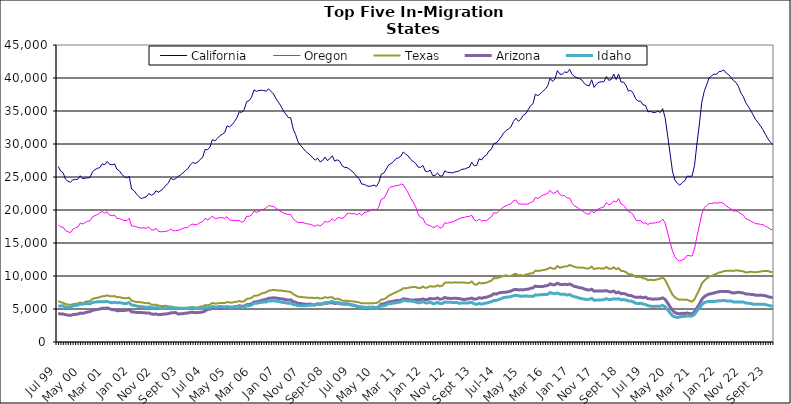
| Category |  California  |  Oregon  |  Texas  |  Arizona  |  Idaho  |
|---|---|---|---|---|---|
| Jul 99 | 26605 | 17749 | 6209 | 4339 | 5471 |
| Aug 99 | 25882 | 17447 | 6022 | 4228 | 5444 |
| Sep 99 | 25644 | 17401 | 5941 | 4237 | 5488 |
| Oct 99 | 24669 | 16875 | 5751 | 4134 | 5279 |
| Nov 99 | 24353 | 16701 | 5680 | 4073 | 5260 |
| Dec 99 | 24218 | 16570 | 5619 | 4042 | 5269 |
| Jan 00 | 24574 | 17109 | 5736 | 4142 | 5485 |
| Feb 00 | 24620 | 17295 | 5789 | 4192 | 5530 |
| Mar 00 | 24655 | 17436 | 5826 | 4226 | 5590 |
| Apr 00 | 25195 | 18009 | 5980 | 4375 | 5748 |
| May 00 | 24730 | 17875 | 5897 | 4337 | 5729 |
| Jun 00 | 24825 | 18113 | 6070 | 4444 | 5853 |
| Jul 00 | 24857 | 18294 | 6163 | 4555 | 5824 |
| Aug 00 | 24913 | 18376 | 6199 | 4603 | 5788 |
| Sep 00 | 25792 | 18971 | 6529 | 4804 | 5976 |
| Oct 00 | 26106 | 19135 | 6643 | 4870 | 6058 |
| Nov 00 | 26315 | 19306 | 6705 | 4926 | 6085 |
| Dec 00 | 26415 | 19570 | 6793 | 4991 | 6096 |
| Jan 01 | 26995 | 19781 | 6942 | 5122 | 6119 |
| Feb 01 | 26851 | 19519 | 6948 | 5089 | 6090 |
| Mar 01 | 27352 | 19720 | 7080 | 5180 | 6143 |
| Apr 01 | 26918 | 19221 | 6943 | 5020 | 6020 |
| May 01 | 26848 | 19126 | 6924 | 4899 | 5950 |
| Jun 01 | 26974 | 19241 | 6959 | 4895 | 6019 |
| Jul 01 | 26172 | 18725 | 6778 | 4737 | 5951 |
| Aug 01 | 25943 | 18736 | 6810 | 4757 | 5973 |
| Sep 01 | 25399 | 18514 | 6688 | 4753 | 5895 |
| Oct 01 | 25050 | 18415 | 6650 | 4780 | 5833 |
| Nov 01 | 24873 | 18381 | 6631 | 4826 | 5850 |
| Dec 01 | 25099 | 18765 | 6708 | 4898 | 5969 |
| Jan 02 | 23158 | 17561 | 6261 | 4560 | 5595 |
| Feb 02 | 22926 | 17573 | 6162 | 4531 | 5560 |
| Mar 02 | 22433 | 17452 | 6052 | 4481 | 5458 |
| Apr 02 | 22012 | 17314 | 6046 | 4458 | 5380 |
| May 02 | 21733 | 17267 | 6007 | 4452 | 5358 |
| Jun 02 | 21876 | 17298 | 5933 | 4444 | 5315 |
| Jul 02 | 21997 | 17209 | 5873 | 4383 | 5243 |
| Aug 02 | 22507 | 17436 | 5929 | 4407 | 5315 |
| Sep 02 | 22244 | 17010 | 5672 | 4248 | 5192 |
| Oct 02 | 22406 | 16952 | 5625 | 4191 | 5167 |
| Nov 02 | 22922 | 17223 | 5663 | 4242 | 5221 |
| Dec 02 | 22693 | 16770 | 5499 | 4142 | 5120 |
| Jan 03 | 22964 | 16694 | 5463 | 4166 | 5089 |
| Feb 03 | 23276 | 16727 | 5461 | 4226 | 5077 |
| Mar 03 | 23736 | 16766 | 5486 | 4251 | 5145 |
| Apr 03 | 24079 | 16859 | 5389 | 4289 | 5145 |
| May 03 | 24821 | 17117 | 5378 | 4415 | 5254 |
| Jun 03 | 24592 | 16812 | 5273 | 4426 | 5135 |
| Jul 03 | 24754 | 16875 | 5226 | 4466 | 5124 |
| Aug 03 | 25092 | 16922 | 5181 | 4244 | 5100 |
| Sep 03 | 25316 | 17036 | 5181 | 4279 | 5086 |
| Oct 03 | 25622 | 17228 | 5139 | 4301 | 5110 |
| Nov 03 | 25984 | 17335 | 5175 | 4362 | 5091 |
| Dec 03 | 26269 | 17350 | 5189 | 4396 | 5113 |
| Jan 04 | 26852 | 17734 | 5255 | 4492 | 5152 |
| Feb 04 | 27184 | 17860 | 5301 | 4502 | 5183 |
| Mar 04 | 27062 | 17757 | 5227 | 4443 | 5056 |
| Apr 04 | 27238 | 17840 | 5227 | 4461 | 5104 |
| May 04 | 27671 | 18113 | 5345 | 4493 | 5095 |
| Jun 04 | 27949 | 18201 | 5416 | 4532 | 5103 |
| Jul 04 | 29172 | 18727 | 5597 | 4697 | 5231 |
| Aug 04 | 29122 | 18529 | 5561 | 4945 | 5197 |
| Sep 04 | 29542 | 18678 | 5656 | 4976 | 5237 |
| Oct 04 | 30674 | 19108 | 5922 | 5188 | 5363 |
| Nov 04 | 30472 | 18716 | 5823 | 5106 | 5321 |
| Dec 04 | 30831 | 18755 | 5838 | 5135 | 5312 |
| Jan 05 | 31224 | 18823 | 5906 | 5155 | 5374 |
| Feb 05 | 31495 | 18842 | 5898 | 5168 | 5357 |
| Mar 05 | 31714 | 18738 | 5894 | 5212 | 5313 |
| Apr 05 | 32750 | 18998 | 6060 | 5340 | 5350 |
| May 05 | 32575 | 18504 | 5989 | 5269 | 5276 |
| Jun 05 | 32898 | 18414 | 5954 | 5252 | 5271 |
| Jul 05 | 33384 | 18395 | 6062 | 5322 | 5322 |
| Aug 05 | 33964 | 18381 | 6113 | 5375 | 5316 |
| Sep 05 | 34897 | 18426 | 6206 | 5493 | 5362 |
| Oct 05 | 34780 | 18132 | 6100 | 5408 | 5308 |
| Nov 05 | 35223 | 18332 | 6162 | 5434 | 5314 |
| Dec 05 | 36415 | 19047 | 6508 | 5658 | 5487 |
| Jan 06 | 36567 | 19032 | 6576 | 5688 | 5480 |
| Feb 06 | 37074 | 19257 | 6692 | 5792 | 5616 |
| Mar 06 | 38207 | 19845 | 6993 | 6052 | 5850 |
| Apr 06 | 37976 | 19637 | 7024 | 6101 | 5864 |
| May 06 | 38099 | 19781 | 7114 | 6178 | 5943 |
| Jun 06 | 38141 | 20061 | 7331 | 6276 | 6018 |
| Jul 06 | 38097 | 20111 | 7431 | 6399 | 6046 |
| Aug 06 | 38021 | 20333 | 7542 | 6450 | 6064 |
| Sep 06 | 38349 | 20686 | 7798 | 6627 | 6232 |
| Oct 06 | 37947 | 20591 | 7825 | 6647 | 6216 |
| Nov 06 | 37565 | 20526 | 7907 | 6707 | 6244 |
| Dec 06 | 36884 | 20272 | 7840 | 6648 | 6192 |
| Jan 07 | 36321 | 19984 | 7789 | 6597 | 6151 |
| Feb 07 | 35752 | 19752 | 7799 | 6554 | 6048 |
| Mar 07 | 35025 | 19547 | 7737 | 6487 | 5989 |
| Apr 07 | 34534 | 19412 | 7685 | 6430 | 5937 |
| May 07 | 34022 | 19296 | 7654 | 6353 | 5858 |
| Jun 07 | 33974 | 19318 | 7577 | 6390 | 5886 |
| Jul 07 | 32298 | 18677 | 7250 | 6117 | 5682 |
| Aug 07 | 31436 | 18322 | 7070 | 6034 | 5617 |
| Sep 07 | 30331 | 18087 | 6853 | 5847 | 5500 |
| Oct 07 | 29813 | 18108 | 6839 | 5821 | 5489 |
| Nov 07 | 29384 | 18105 | 6777 | 5769 | 5481 |
| Dec 07 | 28923 | 17949 | 6760 | 5733 | 5499 |
| Jan 08 | 28627 | 17890 | 6721 | 5732 | 5521 |
| Feb 08 | 28328 | 17834 | 6719 | 5749 | 5579 |
| Mar 08 | 27911 | 17680 | 6690 | 5650 | 5614 |
| Apr 08 | 27543 | 17512 | 6656 | 5612 | 5635 |
| May 08 | 27856 | 17754 | 6705 | 5774 | 5798 |
| Jun 08 | 27287 | 17589 | 6593 | 5717 | 5745 |
| Jul 08 | 27495 | 17834 | 6623 | 5761 | 5807 |
| Aug 08 | 28018 | 18309 | 6789 | 5867 | 5982 |
| Sep-08 | 27491 | 18164 | 6708 | 5864 | 5954 |
| Oct 08 | 27771 | 18291 | 6755 | 5942 | 6032 |
| Nov 08 | 28206 | 18706 | 6787 | 5970 | 6150 |
| Dec 08 | 27408 | 18353 | 6505 | 5832 | 5975 |
| Jan 09 | 27601 | 18778 | 6569 | 5890 | 5995 |
| Feb 09 | 27394 | 18863 | 6483 | 5845 | 5936 |
| Mar 09 | 26690 | 18694 | 6273 | 5751 | 5806 |
| Apr 09 | 26461 | 18943 | 6222 | 5735 | 5777 |
| May 09 | 26435 | 19470 | 6272 | 5819 | 5767 |
| Jun 09 | 26187 | 19522 | 6199 | 5700 | 5649 |
| Jul 09 | 25906 | 19408 | 6171 | 5603 | 5617 |
| Aug 09 | 25525 | 19469 | 6128 | 5533 | 5540 |
| Sep 09 | 25050 | 19249 | 6059 | 5405 | 5437 |
| Oct 09 | 24741 | 19529 | 6004 | 5349 | 5369 |
| Nov 09 | 23928 | 19187 | 5854 | 5271 | 5248 |
| Dec 09 | 23899 | 19607 | 5886 | 5261 | 5195 |
| Jan 10 | 23676 | 19703 | 5881 | 5232 | 5234 |
| Feb 10 | 23592 | 19845 | 5850 | 5272 | 5236 |
| Mar 10 | 23634 | 19946 | 5864 | 5278 | 5219 |
| Apr 10 | 23774 | 20134 | 5889 | 5257 | 5201 |
| May 10 | 23567 | 19966 | 5897 | 5172 | 5105 |
| Jun 10 | 24166 | 20464 | 6087 | 5356 | 5237 |
| Jul 10 | 25410 | 21627 | 6417 | 5742 | 5452 |
| Aug 10 | 25586 | 21744 | 6465 | 5797 | 5491 |
| Sep 10 | 26150 | 22314 | 6667 | 5907 | 5609 |
| Oct 10 | 26807 | 23219 | 6986 | 6070 | 5831 |
| Nov 10 | 27033 | 23520 | 7179 | 6100 | 5810 |
| Dec 10 | 27332 | 23551 | 7361 | 6182 | 5898 |
| Jan 11 | 27769 | 23697 | 7525 | 6276 | 5938 |
| Feb 11 | 27898 | 23718 | 7708 | 6267 | 6016 |
| Mar 11 | 28155 | 23921 | 7890 | 6330 | 6081 |
| Apr 11 | 28790 | 23847 | 8146 | 6544 | 6305 |
| May 11 | 28471 | 23215 | 8131 | 6502 | 6248 |
| Jun 11 | 28191 | 22580 | 8199 | 6445 | 6217 |
| Jul 11 | 27678 | 21867 | 8291 | 6368 | 6202 |
| Aug 11 | 27372 | 21203 | 8321 | 6356 | 6146 |
| Sep 11 | 27082 | 20570 | 8341 | 6387 | 6075 |
| Oct 11 | 26528 | 19442 | 8191 | 6402 | 5932 |
| Nov 11 | 26440 | 18872 | 8176 | 6426 | 5968 |
| Dec 11 | 26770 | 18784 | 8401 | 6533 | 6106 |
| Jan 12 | 25901 | 17963 | 8202 | 6390 | 5933 |
| Feb 12 | 25796 | 17718 | 8266 | 6456 | 5900 |
| Mar 12 | 26042 | 17647 | 8456 | 6600 | 6054 |
| Apr 12 | 25239 | 17386 | 8388 | 6534 | 5838 |
| May 12 | 25238 | 17407 | 8401 | 6558 | 5854 |
| Jun 12 | 25593 | 17673 | 8594 | 6669 | 6009 |
| Jul 12 | 25155 | 17237 | 8432 | 6474 | 5817 |
| Aug 12 | 25146 | 17391 | 8536 | 6539 | 5842 |
| Sep 12 | 25942 | 18102 | 8989 | 6759 | 6061 |
| Oct 12 | 25718 | 17953 | 9012 | 6618 | 6027 |
| Nov 12 | 25677 | 18134 | 9032 | 6611 | 6009 |
| Dec 12 | 25619 | 18166 | 8981 | 6601 | 5999 |
| Jan 13 | 25757 | 18344 | 9051 | 6627 | 5989 |
| Feb-13 | 25830 | 18512 | 9001 | 6606 | 5968 |
| Mar-13 | 25940 | 18689 | 9021 | 6577 | 5853 |
| Apr 13 | 26187 | 18844 | 9013 | 6478 | 5925 |
| May 13 | 26192 | 18884 | 9003 | 6431 | 5924 |
| Jun-13 | 26362 | 19013 | 8948 | 6508 | 5896 |
| Jul 13 | 26467 | 19037 | 8958 | 6559 | 5948 |
| Aug 13 | 27253 | 19198 | 9174 | 6655 | 6020 |
| Sep 13 | 26711 | 18501 | 8747 | 6489 | 5775 |
| Oct 13 | 26733 | 18301 | 8681 | 6511 | 5711 |
| Nov 13 | 27767 | 18620 | 8989 | 6709 | 5860 |
| Dec 13 | 27583 | 18320 | 8863 | 6637 | 5740 |
| Jan 14 | 28107 | 18409 | 8939 | 6735 | 5843 |
| Feb-14 | 28313 | 18383 | 8989 | 6779 | 5893 |
| Mar 14 | 28934 | 18696 | 9160 | 6918 | 6015 |
| Apr 14 | 29192 | 18946 | 9291 | 7036 | 6099 |
| May 14 | 30069 | 19603 | 9701 | 7314 | 6304 |
| Jun 14 | 30163 | 19487 | 9641 | 7252 | 6293 |
| Jul-14 | 30587 | 19754 | 9752 | 7415 | 6427 |
| Aug-14 | 31074 | 20201 | 9882 | 7499 | 6557 |
| Sep 14 | 31656 | 20459 | 9997 | 7536 | 6719 |
| Oct 14 | 32037 | 20663 | 10109 | 7555 | 6786 |
| Nov 14 | 32278 | 20825 | 9992 | 7628 | 6831 |
| Dec 14 | 32578 | 20918 | 10006 | 7705 | 6860 |
| Jan 15 | 33414 | 21396 | 10213 | 7906 | 7000 |
| Feb 15 | 33922 | 21518 | 10337 | 7982 | 7083 |
| Mar 15 | 33447 | 20942 | 10122 | 7891 | 7006 |
| Apr-15 | 33731 | 20893 | 10138 | 7906 | 6931 |
| May 15 | 34343 | 20902 | 10053 | 7895 | 6952 |
| Jun-15 | 34572 | 20870 | 10192 | 7973 | 6966 |
| Jul 15 | 35185 | 20916 | 10303 | 8000 | 6949 |
| Aug 15 | 35780 | 21115 | 10399 | 8126 | 6938 |
| Sep 15 | 36109 | 21246 | 10428 | 8207 | 6896 |
| Oct 15 | 37555 | 21908 | 10813 | 8477 | 7140 |
| Nov 15 | 37319 | 21750 | 10763 | 8390 | 7112 |
| Dec 15 | 37624 | 21990 | 10807 | 8395 | 7149 |
| Jan 16 | 37978 | 22248 | 10892 | 8388 | 7201 |
| Feb 16 | 38285 | 22369 | 10951 | 8508 | 7192 |
| Mar 16 | 38792 | 22506 | 11075 | 8547 | 7226 |
| Apr 16 | 39994 | 22999 | 11286 | 8815 | 7487 |
| May 16 | 39488 | 22548 | 11132 | 8673 | 7382 |
| Jun 16 | 39864 | 22556 | 11100 | 8682 | 7315 |
| Jul 16 | 41123 | 22989 | 11516 | 8903 | 7420 |
| Aug 16 | 40573 | 22333 | 11251 | 8731 | 7261 |
| Sep 16 | 40560 | 22162 | 11340 | 8692 | 7216 |
| Oct 16 | 40923 | 22172 | 11456 | 8742 | 7233 |
| Nov 16 | 40817 | 21818 | 11459 | 8685 | 7101 |
| Dec 16 | 41311 | 21815 | 11681 | 8783 | 7203 |
| Jan 17 | 40543 | 21029 | 11524 | 8609 | 6982 |
| Feb 17 | 40218 | 20613 | 11385 | 8416 | 6852 |
| Mar 17 | 40052 | 20425 | 11276 | 8354 | 6775 |
| Apr 17 | 39913 | 20147 | 11297 | 8218 | 6653 |
| May 17 | 39695 | 19910 | 11265 | 8196 | 6552 |
| Jun 17 | 39177 | 19650 | 11225 | 8034 | 6500 |
| Jul 17 | 38901 | 19419 | 11115 | 7923 | 6429 |
| Aug 17 | 38827 | 19389 | 11168 | 7867 | 6479 |
| Sep 17 | 39736 | 19936 | 11426 | 7991 | 6609 |
| Oct 17 | 38576 | 19547 | 11041 | 7708 | 6315 |
| Nov 17 | 39108 | 20013 | 11158 | 7746 | 6381 |
| Dec 17 | 39359 | 20202 | 11185 | 7743 | 6366 |
| Jan 18 | 39420 | 20362 | 11118 | 7736 | 6380 |
| Feb 18 | 39440 | 20476 | 11128 | 7741 | 6407 |
| Mar 18 | 40218 | 21106 | 11362 | 7789 | 6578 |
| Apr 18 | 39637 | 20788 | 11111 | 7642 | 6423 |
| May 18 | 39777 | 20933 | 11097 | 7591 | 6430 |
| Jun 18 | 40602 | 21381 | 11317 | 7721 | 6554 |
| Jul 18 | 39767 | 21189 | 11038 | 7445 | 6489 |
| Aug 18 | 40608 | 21729 | 11200 | 7560 | 6569 |
| Sep 18 | 39395 | 20916 | 10772 | 7318 | 6383 |
| Oct 18 | 39383 | 20724 | 10740 | 7344 | 6429 |
| Nov 18 | 38891 | 20265 | 10605 | 7255 | 6365 |
| Dec 18 | 38013 | 19741 | 10292 | 7069 | 6205 |
| Jan 19 | 38130 | 19643 | 10261 | 7032 | 6203 |
| Feb 19 | 37658 | 19237 | 10132 | 6892 | 6073 |
| Mar 19 | 36831 | 18492 | 9848 | 6766 | 5863 |
| Apr 19 | 36492 | 18349 | 9839 | 6763 | 5827 |
| May 19 | 36481 | 18407 | 9867 | 6809 | 5873 |
| Jun 19 | 35925 | 17998 | 9661 | 6698 | 5761 |
| Jul 19 | 35843 | 18049 | 9598 | 6800 | 5673 |
| Aug 19 | 34870 | 17785 | 9361 | 6577 | 5512 |
| Sep 19 | 34945 | 18038 | 9428 | 6547 | 5437 |
| Oct 19 | 34802 | 17977 | 9385 | 6483 | 5390 |
| Nov 19 | 34775 | 18072 | 9403 | 6511 | 5401 |
| Dec 19 | 34976 | 18140 | 9518 | 6521 | 5419 |
| Jan 20 | 34774 | 18209 | 9594 | 6561 | 5434 |
| Feb 20 | 35352 | 18632 | 9804 | 6682 | 5543 |
| Mar 20 | 34013 | 18041 | 9411 | 6464 | 5330 |
| Apr 20 | 31385 | 16629 | 8666 | 5922 | 4906 |
| May 20 | 28657 | 15123 | 7927 | 5355 | 4419 |
| Jun 20 | 25915 | 13817 | 7164 | 4815 | 3992 |
| Jul 20 | 24545 | 12926 | 6776 | 4457 | 3810 |
| Aug 20 | 24048 | 12443 | 6521 | 4326 | 3720 |
| Sep 20 | 23756 | 12258 | 6386 | 4266 | 3784 |
| Oct 20 | 24166 | 12429 | 6452 | 4347 | 3861 |
| Nov 20 | 24404 | 12597 | 6386 | 4324 | 3883 |
| Dec 20 | 25120 | 13122 | 6420 | 4394 | 3974 |
| Jan 21 | 25111 | 13080 | 6236 | 4304 | 3924 |
| Feb 21 | 25114 | 13015 | 6094 | 4260 | 3930 |
| Mar 21 | 26701 | 14096 | 6455 | 4567 | 4185 |
| Apr 21 | 29998 | 15978 | 7222 | 5164 | 4697 |
| May 21 | 33020 | 17641 | 7969 | 5748 | 5148 |
| Jun 21 | 36320 | 19369 | 8840 | 6450 | 5628 |
| Jul 21 | 37989 | 20320 | 9306 | 6877 | 5984 |
| Aug 21 | 39007 | 20657 | 9615 | 7094 | 6084 |
| Sep 21 | 40023 | 20974 | 9914 | 7277 | 6151 |
| Oct 21 | 40348 | 20966 | 10003 | 7327 | 6140 |
| Nov 21 | 40599 | 21096 | 10203 | 7437 | 6136 |
| Dec 21 | 40548 | 21032 | 10328 | 7532 | 6183 |
| Jan 22 | 40967 | 21106 | 10535 | 7618 | 6237 |
| Feb 22 | 41019 | 21125 | 10579 | 7673 | 6236 |
| Mar 22 | 41220 | 20949 | 10751 | 7660 | 6310 |
| Apr 22 | 40730 | 20602 | 10772 | 7661 | 6221 |
| May 22 | 40504 | 20370 | 10792 | 7636 | 6210 |
| Jun 22 | 40013 | 20127 | 10802 | 7504 | 6199 |
| Jul 22 | 39582 | 19846 | 10761 | 7419 | 6050 |
| Aug 22 | 39321 | 19865 | 10868 | 7487 | 6071 |
| Sep 22 | 38685 | 19666 | 10811 | 7536 | 6074 |
| Oct 22 | 37700 | 19450 | 10764 | 7469 | 6042 |
| Nov 22 | 37133 | 19198 | 10701 | 7425 | 6042 |
| Dec 22 | 36232 | 18659 | 10527 | 7261 | 5898 |
| Jan 23 | 35674 | 18528 | 10578 | 7263 | 5879 |
| Feb 23 | 35072 | 18344 | 10642 | 7211 | 5827 |
| Mar 23 | 34396 | 18133 | 10609 | 7183 | 5713 |
| Apr 23 | 33708 | 17931 | 10559 | 7074 | 5706 |
| May 23 | 33245 | 17904 | 10624 | 7091 | 5712 |
| Jun 23 | 32727 | 17831 | 10663 | 7105 | 5726 |
| Jul 23 | 32148 | 17773 | 10760 | 7058 | 5719 |
| Aug 23 | 31461 | 17513 | 10759 | 6999 | 5681 |
| Sep 23 | 30794 | 17376 | 10754 | 6882 | 5566 |
| Oct 23 | 30268 | 17096 | 10620 | 6775 | 5477 |
| Nov 23 | 29929 | 17029 | 10602 | 6746 | 5443 |